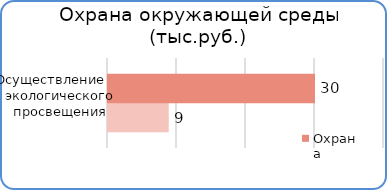
| Category | Факт | План  |
|---|---|---|
| Осуществление экологического просвещения и воспитания | 8800 | 30000 |